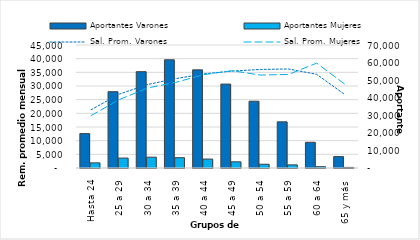
| Category | Aportantes Varones | Aportantes Mujeres |
|---|---|---|
| 0 | 19576 | 2921 |
| 1 | 43422 | 5654 |
| 2 | 54827 | 6156 |
| 3 | 61572 | 5866 |
| 4 | 55844 | 5081 |
| 5 | 47757 | 3518 |
| 6 | 37998 | 2143 |
| 7 | 26275 | 1791 |
| 8 | 14620 | 740 |
| 9 | 6493 | 346 |